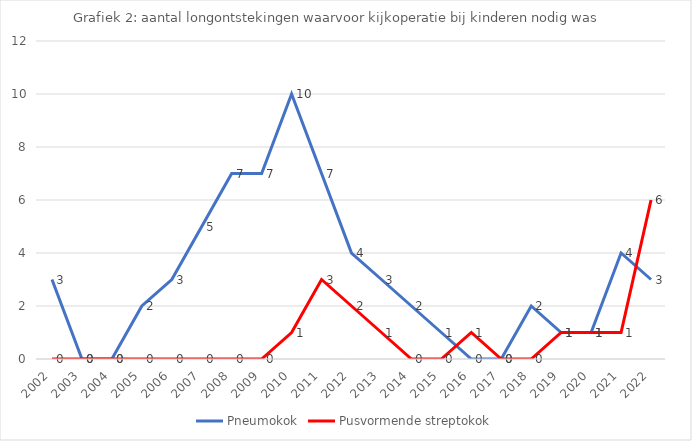
| Category | Pneumokok | Pusvormende streptokok |
|---|---|---|
| 2002.0 | 3 | 0 |
| 2003.0 | 0 | 0 |
| 2004.0 | 0 | 0 |
| 2005.0 | 2 | 0 |
| 2006.0 | 3 | 0 |
| 2007.0 | 5 | 0 |
| 2008.0 | 7 | 0 |
| 2009.0 | 7 | 0 |
| 2010.0 | 10 | 1 |
| 2011.0 | 7 | 3 |
| 2012.0 | 4 | 2 |
| 2013.0 | 3 | 1 |
| 2014.0 | 2 | 0 |
| 2015.0 | 1 | 0 |
| 2016.0 | 0 | 1 |
| 2017.0 | 0 | 0 |
| 2018.0 | 2 | 0 |
| 2019.0 | 1 | 1 |
| 2020.0 | 1 | 1 |
| 2021.0 | 4 | 1 |
| 2022.0 | 3 | 6 |